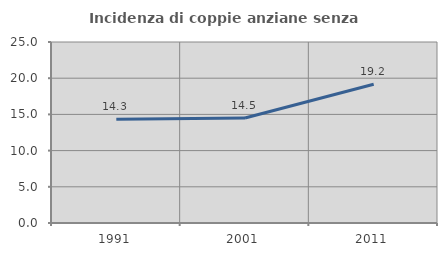
| Category | Incidenza di coppie anziane senza figli  |
|---|---|
| 1991.0 | 14.319 |
| 2001.0 | 14.496 |
| 2011.0 | 19.171 |